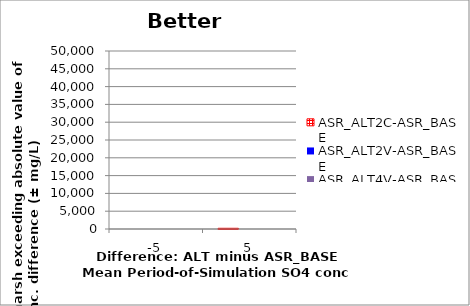
| Category | ASR_ALT2C-ASR_BASE | ASR_ALT2V-ASR_BASE | ASR_ALT4V-ASR_BASE |
|---|---|---|---|
| -5.0 | 0 | 0 | 0 |
| 5.0 | 200 | 0 | 0 |